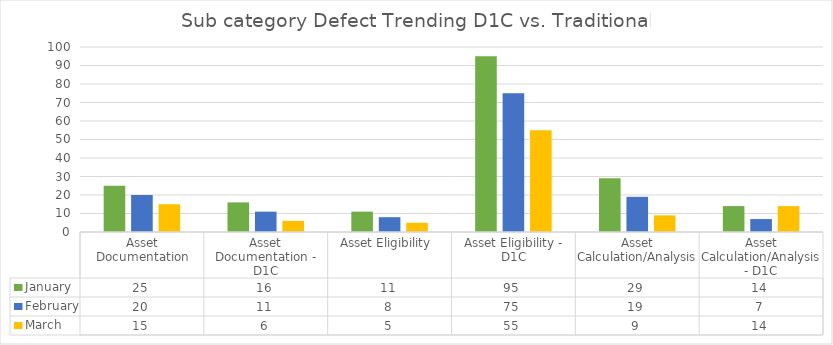
| Category | January | February | March |
|---|---|---|---|
| Asset Documentation | 25 | 20 | 15 |
| Asset Documentation - D1C | 16 | 11 | 6 |
| Asset Eligibility  | 11 | 8 | 5 |
| Asset Eligibility - D1C | 95 | 75 | 55 |
| Asset Calculation/Analysis | 29 | 19 | 9 |
| Asset Calculation/Analysis - D1C | 14 | 7 | 14 |